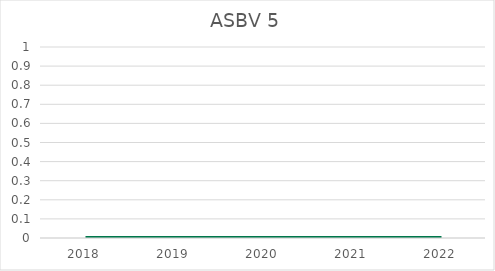
| Category | ASBV 5 |
|---|---|
| 2018.0 | 0 |
| 2019.0 | 0 |
| 2020.0 | 0 |
| 2021.0 | 0 |
| 2022.0 | 0 |